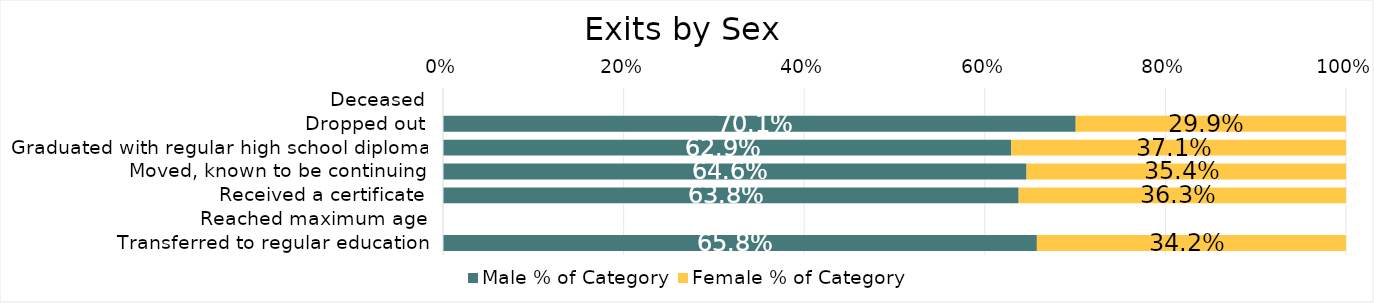
| Category | Male % of Category | Female % of Category |
|---|---|---|
| Deceased | 0 | 0 |
| Dropped out | 0.701 | 0.299 |
| Graduated with regular high school diploma | 0.629 | 0.371 |
| Moved, known to be continuing | 0.646 | 0.354 |
| Received a certificate | 0.638 | 0.362 |
| Reached maximum age | 0 | 0 |
| Transferred to regular education | 0.658 | 0.342 |